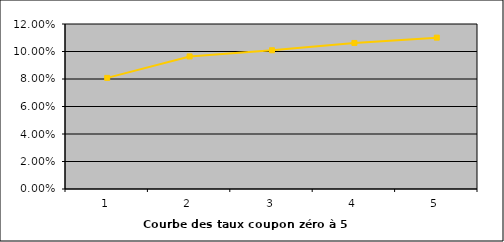
| Category | Series 1 |
|---|---|
| 1.0 | 0.081 |
| 2.0 | 0.096 |
| 3.0 | 0.101 |
| 4.0 | 0.106 |
| 5.0 | 0.11 |